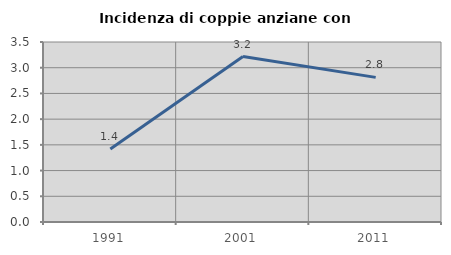
| Category | Incidenza di coppie anziane con figli |
|---|---|
| 1991.0 | 1.42 |
| 2001.0 | 3.216 |
| 2011.0 | 2.812 |